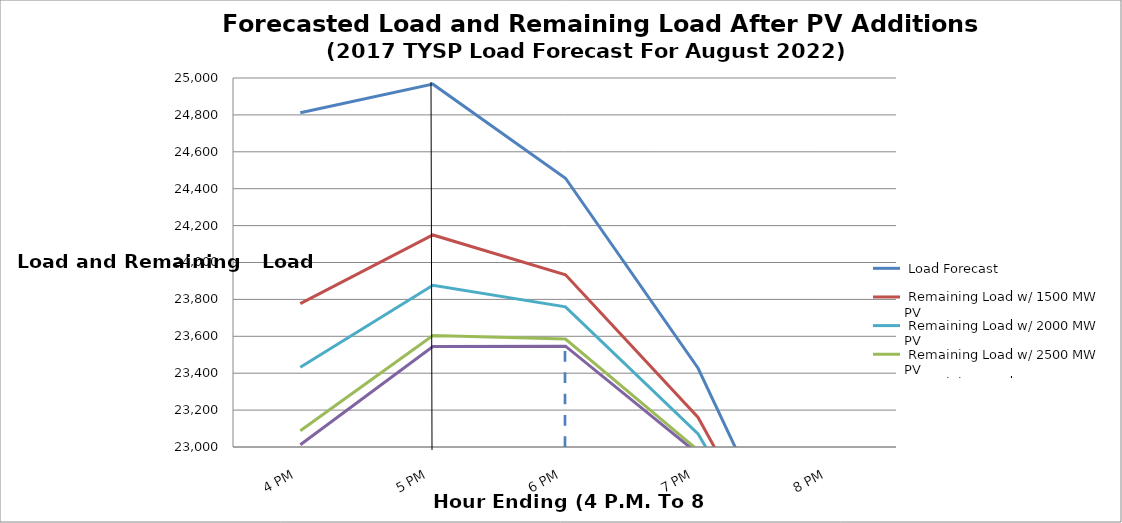
| Category |  Load Forecast |  Remaining Load w/ 1500 MW PV  |  Remaining Load w/ 2000 MW PV  |  Remaining Load w/ 2500 MW PV  |  Remaining Load w/ 2610 MW PV  |
|---|---|---|---|---|---|
| 0.666666666666667 | 24811.794 | 23777.36 | 23432.548 | 23087.737 | 23011.878 |
| 0.708333333333333 | 24966.621 | 24149.36 | 23876.94 | 23604.519 | 23544.587 |
| 0.75 | 24456.684 | 23933.713 | 23759.389 | 23585.065 | 23546.714 |
| 0.791666666666667 | 23426.867 | 23160.048 | 23071.108 | 22982.168 | 22962.601 |
| 0.833333333333333 | 21898.476 | 21853.361 | 21838.322 | 21823.284 | 21819.975 |